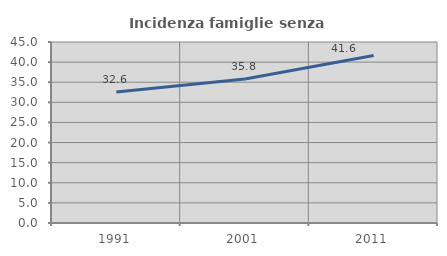
| Category | Incidenza famiglie senza nuclei |
|---|---|
| 1991.0 | 32.575 |
| 2001.0 | 35.821 |
| 2011.0 | 41.628 |